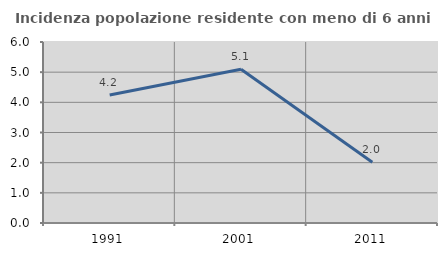
| Category | Incidenza popolazione residente con meno di 6 anni |
|---|---|
| 1991.0 | 4.241 |
| 2001.0 | 5.097 |
| 2011.0 | 2.015 |